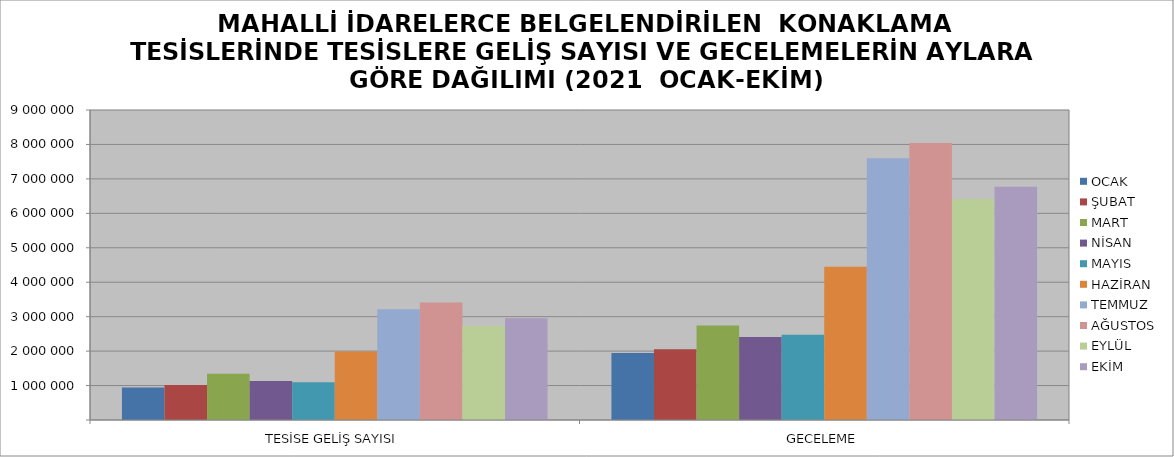
| Category | OCAK | ŞUBAT | MART | NİSAN | MAYIS | HAZİRAN | TEMMUZ | AĞUSTOS | EYLÜL | EKİM |
|---|---|---|---|---|---|---|---|---|---|---|
| TESİSE GELİŞ SAYISI | 940331 | 1017199 | 1342202 | 1131069 | 1098456 | 1989433 | 3215014 | 3414690 | 2728285 | 2955029 |
| GECELEME | 1943007 | 2056594 | 2743257 | 2406723 | 2471826 | 4450821 | 7597288 | 8039529 | 6417353 | 6772005 |